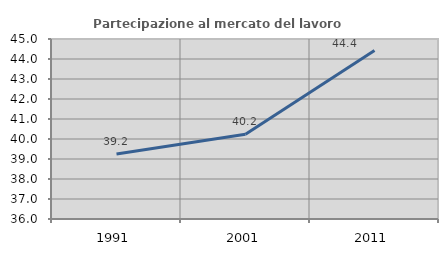
| Category | Partecipazione al mercato del lavoro  femminile |
|---|---|
| 1991.0 | 39.248 |
| 2001.0 | 40.239 |
| 2011.0 | 44.43 |